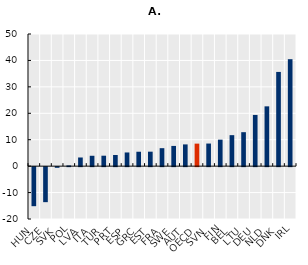
| Category | Q2 2022 |
|---|---|
| HUN | -14.775 |
| CZE | -13.25 |
| SVK | -0.25 |
| POL | 0.275 |
| LVA | 3.275 |
| ITA | 3.925 |
| TUR | 3.95 |
| PRT | 4.225 |
| ESP | 5.175 |
| GRC | 5.45 |
| EST | 5.475 |
| FRA | 6.8 |
| SWE | 7.65 |
| AUT | 8.225 |
| OECD | 8.519 |
| SVN | 8.55 |
| FIN | 10.025 |
| BEL | 11.725 |
| LTU | 12.85 |
| DEU | 19.375 |
| NLD | 22.625 |
| DNK | 35.65 |
| IRL | 40.467 |